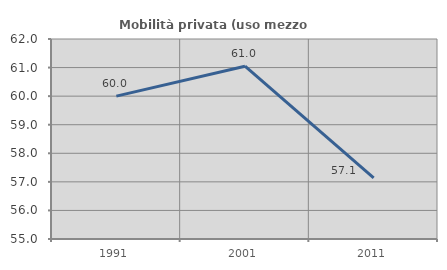
| Category | Mobilità privata (uso mezzo privato) |
|---|---|
| 1991.0 | 60 |
| 2001.0 | 61.049 |
| 2011.0 | 57.143 |